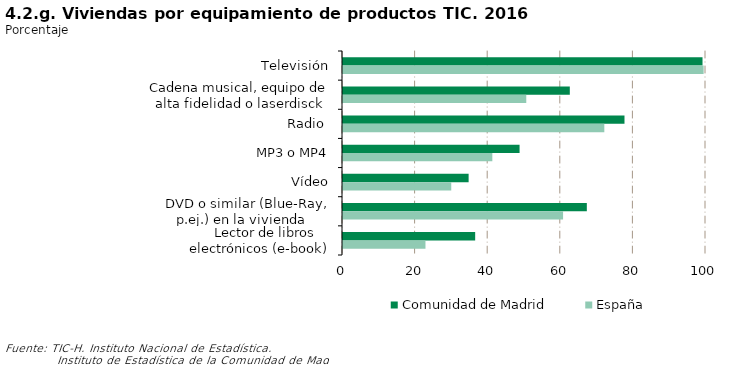
| Category | Comunidad de Madrid | España |
|---|---|---|
| Televisión | 99.04 | 99.343 |
| Cadena musical, equipo de alta fidelidad o laserdisck | 62.481 | 50.487 |
| Radio  | 77.544 | 71.99 |
| MP3 o MP4 | 48.642 | 41.139 |
| Vídeo | 34.607 | 29.82 |
|    DVD o similar (Blue-Ray, p.ej.) en la vivienda | 67.171 | 60.627 |
|    Lector de libros electrónicos (e-book) | 36.412 | 22.719 |